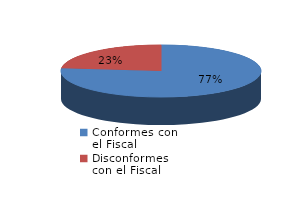
| Category | Series 0 |
|---|---|
| 0 | 436 |
| 1 | 133 |